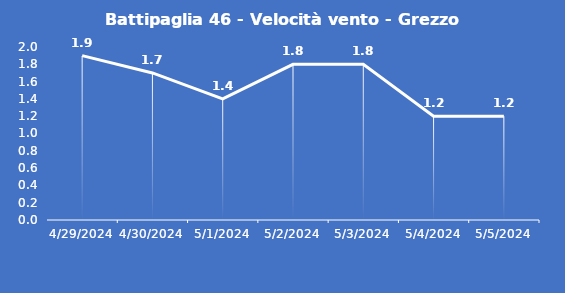
| Category | Battipaglia 46 - Velocità vento - Grezzo (m/s) |
|---|---|
| 4/29/24 | 1.9 |
| 4/30/24 | 1.7 |
| 5/1/24 | 1.4 |
| 5/2/24 | 1.8 |
| 5/3/24 | 1.8 |
| 5/4/24 | 1.2 |
| 5/5/24 | 1.2 |